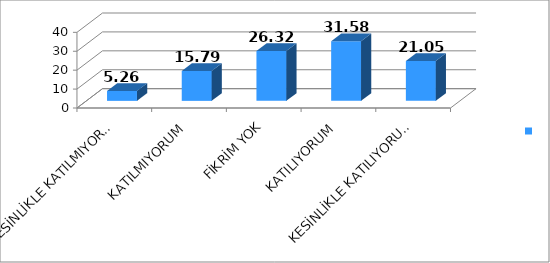
| Category | Series 0 |
|---|---|
| KESİNLİKLE KATILMIYORUM | 5.26 |
| KATILMIYORUM | 15.79 |
| FİKRİM YOK | 26.32 |
| KATILIYORUM | 31.58 |
| KESİNLİKLE KATILIYORUM | 21.05 |